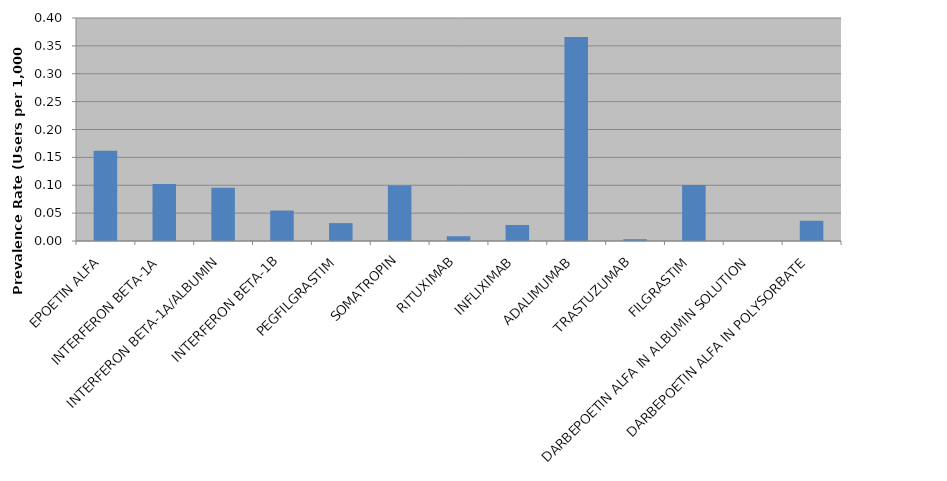
| Category | Total |
|---|---|
| EPOETIN ALFA | 0.162 |
| INTERFERON BETA-1A | 0.102 |
| INTERFERON BETA-1A/ALBUMIN | 0.096 |
| INTERFERON BETA-1B | 0.055 |
| PEGFILGRASTIM | 0.032 |
| SOMATROPIN | 0.1 |
| RITUXIMAB | 0.009 |
| INFLIXIMAB | 0.029 |
| ADALIMUMAB | 0.366 |
| TRASTUZUMAB | 0.003 |
| FILGRASTIM | 0.1 |
| DARBEPOETIN ALFA IN ALBUMIN SOLUTION | 0 |
| DARBEPOETIN ALFA IN POLYSORBATE | 0.036 |